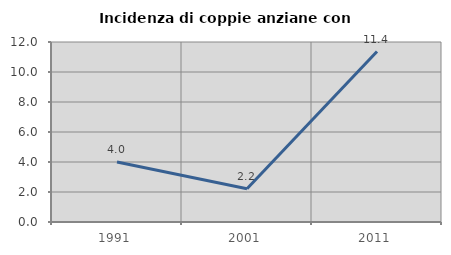
| Category | Incidenza di coppie anziane con figli |
|---|---|
| 1991.0 | 4 |
| 2001.0 | 2.222 |
| 2011.0 | 11.364 |